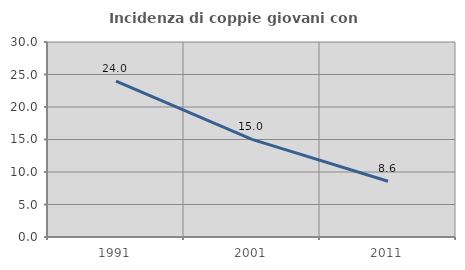
| Category | Incidenza di coppie giovani con figli |
|---|---|
| 1991.0 | 23.982 |
| 2001.0 | 15.013 |
| 2011.0 | 8.568 |